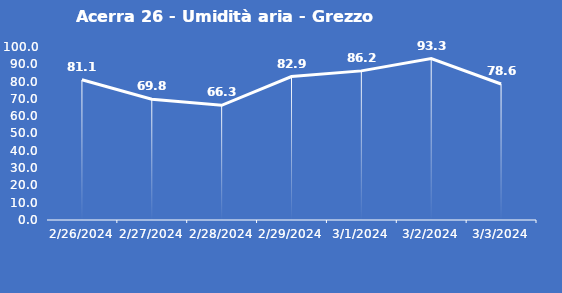
| Category | Acerra 26 - Umidità aria - Grezzo (%) |
|---|---|
| 2/26/24 | 81.1 |
| 2/27/24 | 69.8 |
| 2/28/24 | 66.3 |
| 2/29/24 | 82.9 |
| 3/1/24 | 86.2 |
| 3/2/24 | 93.3 |
| 3/3/24 | 78.6 |